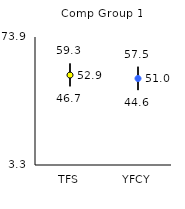
| Category | 25th | 75th | Mean |
|---|---|---|---|
| TFS | 46.7 | 59.3 | 52.9 |
| YFCY | 44.6 | 57.5 | 51.01 |